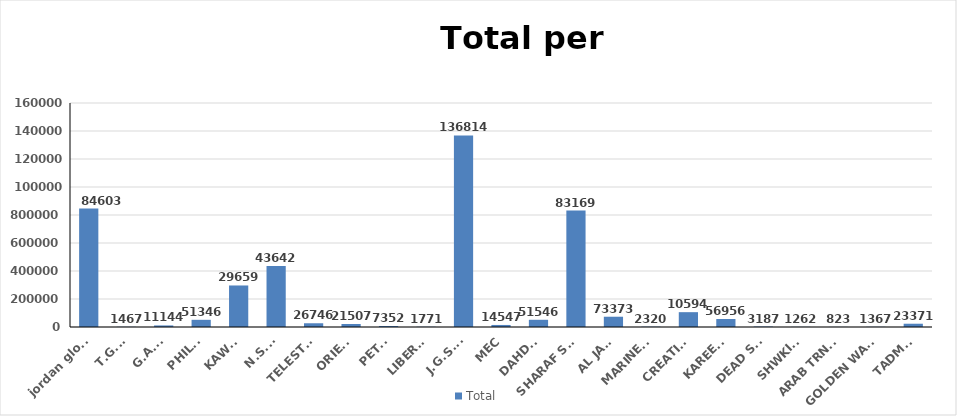
| Category | Total |
|---|---|
| jordan global | 846036 |
| T.G.F. | 1467 |
| G.A.C. | 11144 |
| PHILCO | 51346 |
| KAWAR | 296593 |
| N.S.S. | 436426 |
| TELESTAR | 26746 |
| ORIENT | 21507 |
| PETRA | 7352 |
| LIBERTY | 1771 |
| J.G.S.A. | 1368148 |
| MEC | 14547 |
| DAHDAL | 51546 |
| SHARAF SHG. | 831696 |
| AL JAZI | 73373 |
| MARINERS | 2320 |
| CREATIVE | 105941 |
| KAREEM | 56956 |
| DEAD SEA | 3187 |
| SHWKINI | 1262 |
| ARAB TRNSIT | 823 |
| GOLDEN WAYS | 1367 |
| TADMOR | 23371 |